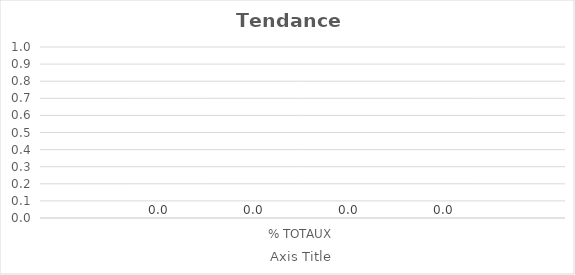
| Category | Series 0 | Series 1 | Series 2 | Series 3 |
|---|---|---|---|---|
| % TOTAUX | 0 | 0 | 0 | 0 |